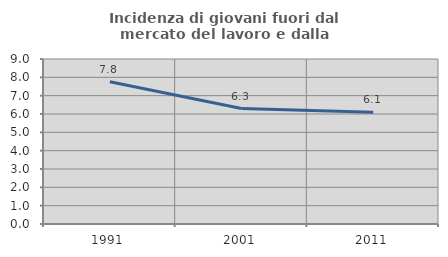
| Category | Incidenza di giovani fuori dal mercato del lavoro e dalla formazione  |
|---|---|
| 1991.0 | 7.756 |
| 2001.0 | 6.299 |
| 2011.0 | 6.091 |